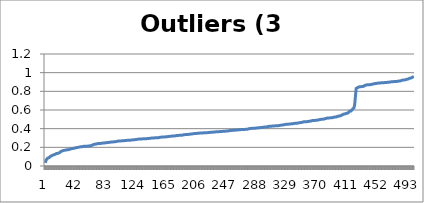
| Category | Outliers (3 dice) |
|---|---|
| 0 | 0.034 |
| 1 | 0.066 |
| 2 | 0.074 |
| 3 | 0.083 |
| 4 | 0.084 |
| 5 | 0.09 |
| 6 | 0.094 |
| 7 | 0.104 |
| 8 | 0.108 |
| 9 | 0.111 |
| 10 | 0.119 |
| 11 | 0.119 |
| 12 | 0.123 |
| 13 | 0.125 |
| 14 | 0.128 |
| 15 | 0.134 |
| 16 | 0.134 |
| 17 | 0.136 |
| 18 | 0.139 |
| 19 | 0.143 |
| 20 | 0.147 |
| 21 | 0.156 |
| 22 | 0.158 |
| 23 | 0.162 |
| 24 | 0.167 |
| 25 | 0.167 |
| 26 | 0.17 |
| 27 | 0.17 |
| 28 | 0.171 |
| 29 | 0.173 |
| 30 | 0.174 |
| 31 | 0.174 |
| 32 | 0.179 |
| 33 | 0.18 |
| 34 | 0.182 |
| 35 | 0.185 |
| 36 | 0.187 |
| 37 | 0.188 |
| 38 | 0.188 |
| 39 | 0.19 |
| 40 | 0.192 |
| 41 | 0.195 |
| 42 | 0.197 |
| 43 | 0.198 |
| 44 | 0.199 |
| 45 | 0.201 |
| 46 | 0.204 |
| 47 | 0.205 |
| 48 | 0.206 |
| 49 | 0.206 |
| 50 | 0.208 |
| 51 | 0.21 |
| 52 | 0.211 |
| 53 | 0.212 |
| 54 | 0.213 |
| 55 | 0.213 |
| 56 | 0.213 |
| 57 | 0.213 |
| 58 | 0.214 |
| 59 | 0.215 |
| 60 | 0.216 |
| 61 | 0.217 |
| 62 | 0.219 |
| 63 | 0.222 |
| 64 | 0.224 |
| 65 | 0.229 |
| 66 | 0.233 |
| 67 | 0.234 |
| 68 | 0.234 |
| 69 | 0.236 |
| 70 | 0.238 |
| 71 | 0.24 |
| 72 | 0.24 |
| 73 | 0.24 |
| 74 | 0.242 |
| 75 | 0.242 |
| 76 | 0.243 |
| 77 | 0.245 |
| 78 | 0.245 |
| 79 | 0.246 |
| 80 | 0.247 |
| 81 | 0.248 |
| 82 | 0.25 |
| 83 | 0.25 |
| 84 | 0.251 |
| 85 | 0.251 |
| 86 | 0.254 |
| 87 | 0.255 |
| 88 | 0.256 |
| 89 | 0.257 |
| 90 | 0.257 |
| 91 | 0.257 |
| 92 | 0.257 |
| 93 | 0.26 |
| 94 | 0.261 |
| 95 | 0.261 |
| 96 | 0.262 |
| 97 | 0.264 |
| 98 | 0.267 |
| 99 | 0.267 |
| 100 | 0.268 |
| 101 | 0.269 |
| 102 | 0.269 |
| 103 | 0.269 |
| 104 | 0.269 |
| 105 | 0.27 |
| 106 | 0.271 |
| 107 | 0.272 |
| 108 | 0.273 |
| 109 | 0.273 |
| 110 | 0.275 |
| 111 | 0.275 |
| 112 | 0.276 |
| 113 | 0.276 |
| 114 | 0.277 |
| 115 | 0.277 |
| 116 | 0.278 |
| 117 | 0.279 |
| 118 | 0.28 |
| 119 | 0.281 |
| 120 | 0.282 |
| 121 | 0.282 |
| 122 | 0.283 |
| 123 | 0.285 |
| 124 | 0.286 |
| 125 | 0.286 |
| 126 | 0.288 |
| 127 | 0.289 |
| 128 | 0.29 |
| 129 | 0.29 |
| 130 | 0.29 |
| 131 | 0.29 |
| 132 | 0.291 |
| 133 | 0.291 |
| 134 | 0.292 |
| 135 | 0.292 |
| 136 | 0.293 |
| 137 | 0.293 |
| 138 | 0.293 |
| 139 | 0.296 |
| 140 | 0.296 |
| 141 | 0.296 |
| 142 | 0.296 |
| 143 | 0.299 |
| 144 | 0.299 |
| 145 | 0.3 |
| 146 | 0.301 |
| 147 | 0.301 |
| 148 | 0.302 |
| 149 | 0.302 |
| 150 | 0.303 |
| 151 | 0.303 |
| 152 | 0.304 |
| 153 | 0.304 |
| 154 | 0.305 |
| 155 | 0.307 |
| 156 | 0.309 |
| 157 | 0.31 |
| 158 | 0.31 |
| 159 | 0.31 |
| 160 | 0.311 |
| 161 | 0.311 |
| 162 | 0.311 |
| 163 | 0.313 |
| 164 | 0.314 |
| 165 | 0.314 |
| 166 | 0.316 |
| 167 | 0.317 |
| 168 | 0.318 |
| 169 | 0.318 |
| 170 | 0.318 |
| 171 | 0.32 |
| 172 | 0.321 |
| 173 | 0.321 |
| 174 | 0.322 |
| 175 | 0.322 |
| 176 | 0.325 |
| 177 | 0.326 |
| 178 | 0.327 |
| 179 | 0.328 |
| 180 | 0.328 |
| 181 | 0.328 |
| 182 | 0.329 |
| 183 | 0.329 |
| 184 | 0.33 |
| 185 | 0.331 |
| 186 | 0.333 |
| 187 | 0.335 |
| 188 | 0.335 |
| 189 | 0.336 |
| 190 | 0.337 |
| 191 | 0.337 |
| 192 | 0.337 |
| 193 | 0.339 |
| 194 | 0.34 |
| 195 | 0.34 |
| 196 | 0.341 |
| 197 | 0.343 |
| 198 | 0.344 |
| 199 | 0.344 |
| 200 | 0.345 |
| 201 | 0.347 |
| 202 | 0.348 |
| 203 | 0.348 |
| 204 | 0.349 |
| 205 | 0.35 |
| 206 | 0.351 |
| 207 | 0.352 |
| 208 | 0.352 |
| 209 | 0.353 |
| 210 | 0.354 |
| 211 | 0.354 |
| 212 | 0.355 |
| 213 | 0.355 |
| 214 | 0.356 |
| 215 | 0.356 |
| 216 | 0.356 |
| 217 | 0.357 |
| 218 | 0.357 |
| 219 | 0.357 |
| 220 | 0.358 |
| 221 | 0.358 |
| 222 | 0.361 |
| 223 | 0.361 |
| 224 | 0.361 |
| 225 | 0.361 |
| 226 | 0.363 |
| 227 | 0.363 |
| 228 | 0.364 |
| 229 | 0.365 |
| 230 | 0.365 |
| 231 | 0.367 |
| 232 | 0.367 |
| 233 | 0.367 |
| 234 | 0.368 |
| 235 | 0.368 |
| 236 | 0.37 |
| 237 | 0.37 |
| 238 | 0.37 |
| 239 | 0.371 |
| 240 | 0.372 |
| 241 | 0.372 |
| 242 | 0.372 |
| 243 | 0.373 |
| 244 | 0.374 |
| 245 | 0.374 |
| 246 | 0.375 |
| 247 | 0.375 |
| 248 | 0.377 |
| 249 | 0.379 |
| 250 | 0.379 |
| 251 | 0.38 |
| 252 | 0.38 |
| 253 | 0.382 |
| 254 | 0.383 |
| 255 | 0.383 |
| 256 | 0.384 |
| 257 | 0.384 |
| 258 | 0.385 |
| 259 | 0.385 |
| 260 | 0.385 |
| 261 | 0.388 |
| 262 | 0.388 |
| 263 | 0.389 |
| 264 | 0.39 |
| 265 | 0.391 |
| 266 | 0.391 |
| 267 | 0.391 |
| 268 | 0.392 |
| 269 | 0.392 |
| 270 | 0.393 |
| 271 | 0.393 |
| 272 | 0.393 |
| 273 | 0.394 |
| 274 | 0.395 |
| 275 | 0.399 |
| 276 | 0.402 |
| 277 | 0.402 |
| 278 | 0.402 |
| 279 | 0.403 |
| 280 | 0.404 |
| 281 | 0.404 |
| 282 | 0.404 |
| 283 | 0.405 |
| 284 | 0.406 |
| 285 | 0.407 |
| 286 | 0.407 |
| 287 | 0.409 |
| 288 | 0.409 |
| 289 | 0.41 |
| 290 | 0.411 |
| 291 | 0.412 |
| 292 | 0.413 |
| 293 | 0.414 |
| 294 | 0.416 |
| 295 | 0.416 |
| 296 | 0.417 |
| 297 | 0.418 |
| 298 | 0.418 |
| 299 | 0.418 |
| 300 | 0.421 |
| 301 | 0.423 |
| 302 | 0.424 |
| 303 | 0.425 |
| 304 | 0.426 |
| 305 | 0.426 |
| 306 | 0.426 |
| 307 | 0.428 |
| 308 | 0.428 |
| 309 | 0.429 |
| 310 | 0.43 |
| 311 | 0.431 |
| 312 | 0.431 |
| 313 | 0.431 |
| 314 | 0.432 |
| 315 | 0.432 |
| 316 | 0.433 |
| 317 | 0.435 |
| 318 | 0.436 |
| 319 | 0.438 |
| 320 | 0.439 |
| 321 | 0.44 |
| 322 | 0.442 |
| 323 | 0.443 |
| 324 | 0.443 |
| 325 | 0.446 |
| 326 | 0.447 |
| 327 | 0.448 |
| 328 | 0.448 |
| 329 | 0.449 |
| 330 | 0.449 |
| 331 | 0.45 |
| 332 | 0.45 |
| 333 | 0.452 |
| 334 | 0.453 |
| 335 | 0.454 |
| 336 | 0.454 |
| 337 | 0.457 |
| 338 | 0.457 |
| 339 | 0.457 |
| 340 | 0.457 |
| 341 | 0.46 |
| 342 | 0.462 |
| 343 | 0.463 |
| 344 | 0.465 |
| 345 | 0.466 |
| 346 | 0.468 |
| 347 | 0.468 |
| 348 | 0.47 |
| 349 | 0.473 |
| 350 | 0.473 |
| 351 | 0.473 |
| 352 | 0.474 |
| 353 | 0.474 |
| 354 | 0.476 |
| 355 | 0.477 |
| 356 | 0.478 |
| 357 | 0.48 |
| 358 | 0.482 |
| 359 | 0.482 |
| 360 | 0.486 |
| 361 | 0.488 |
| 362 | 0.488 |
| 363 | 0.488 |
| 364 | 0.489 |
| 365 | 0.489 |
| 366 | 0.49 |
| 367 | 0.491 |
| 368 | 0.492 |
| 369 | 0.493 |
| 370 | 0.497 |
| 371 | 0.498 |
| 372 | 0.499 |
| 373 | 0.5 |
| 374 | 0.501 |
| 375 | 0.502 |
| 376 | 0.502 |
| 377 | 0.504 |
| 378 | 0.507 |
| 379 | 0.509 |
| 380 | 0.511 |
| 381 | 0.513 |
| 382 | 0.514 |
| 383 | 0.514 |
| 384 | 0.515 |
| 385 | 0.516 |
| 386 | 0.516 |
| 387 | 0.517 |
| 388 | 0.519 |
| 389 | 0.52 |
| 390 | 0.524 |
| 391 | 0.525 |
| 392 | 0.526 |
| 393 | 0.526 |
| 394 | 0.53 |
| 395 | 0.532 |
| 396 | 0.535 |
| 397 | 0.536 |
| 398 | 0.536 |
| 399 | 0.538 |
| 400 | 0.543 |
| 401 | 0.548 |
| 402 | 0.548 |
| 403 | 0.555 |
| 404 | 0.555 |
| 405 | 0.558 |
| 406 | 0.562 |
| 407 | 0.564 |
| 408 | 0.565 |
| 409 | 0.568 |
| 410 | 0.569 |
| 411 | 0.587 |
| 412 | 0.588 |
| 413 | 0.589 |
| 414 | 0.595 |
| 415 | 0.609 |
| 416 | 0.614 |
| 417 | 0.622 |
| 418 | 0.659 |
| 419 | 0.661 |
| 420 | 0.831 |
| 421 | 0.835 |
| 422 | 0.84 |
| 423 | 0.844 |
| 424 | 0.848 |
| 425 | 0.85 |
| 426 | 0.85 |
| 427 | 0.851 |
| 428 | 0.851 |
| 429 | 0.854 |
| 430 | 0.854 |
| 431 | 0.862 |
| 432 | 0.864 |
| 433 | 0.867 |
| 434 | 0.869 |
| 435 | 0.869 |
| 436 | 0.87 |
| 437 | 0.87 |
| 438 | 0.871 |
| 439 | 0.871 |
| 440 | 0.873 |
| 441 | 0.875 |
| 442 | 0.877 |
| 443 | 0.879 |
| 444 | 0.881 |
| 445 | 0.883 |
| 446 | 0.883 |
| 447 | 0.883 |
| 448 | 0.886 |
| 449 | 0.888 |
| 450 | 0.888 |
| 451 | 0.889 |
| 452 | 0.889 |
| 453 | 0.89 |
| 454 | 0.891 |
| 455 | 0.891 |
| 456 | 0.892 |
| 457 | 0.892 |
| 458 | 0.893 |
| 459 | 0.893 |
| 460 | 0.895 |
| 461 | 0.896 |
| 462 | 0.896 |
| 463 | 0.896 |
| 464 | 0.897 |
| 465 | 0.899 |
| 466 | 0.9 |
| 467 | 0.901 |
| 468 | 0.903 |
| 469 | 0.903 |
| 470 | 0.904 |
| 471 | 0.904 |
| 472 | 0.905 |
| 473 | 0.905 |
| 474 | 0.906 |
| 475 | 0.907 |
| 476 | 0.907 |
| 477 | 0.907 |
| 478 | 0.911 |
| 479 | 0.911 |
| 480 | 0.912 |
| 481 | 0.918 |
| 482 | 0.919 |
| 483 | 0.92 |
| 484 | 0.922 |
| 485 | 0.923 |
| 486 | 0.923 |
| 487 | 0.925 |
| 488 | 0.928 |
| 489 | 0.931 |
| 490 | 0.931 |
| 491 | 0.937 |
| 492 | 0.939 |
| 493 | 0.942 |
| 494 | 0.943 |
| 495 | 0.944 |
| 496 | 0.95 |
| 497 | 0.954 |
| 498 | 0.959 |
| 499 | 0.963 |